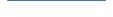
| Category | Series 0 |
|---|---|
| 0 | 534 |
| 1 | 564 |
| 2 | 812 |
| 3 | 759 |
| 4 | 601 |
| 5 | 604 |
| 6 | 620 |
| 7 | 626 |
| 8 | 602 |